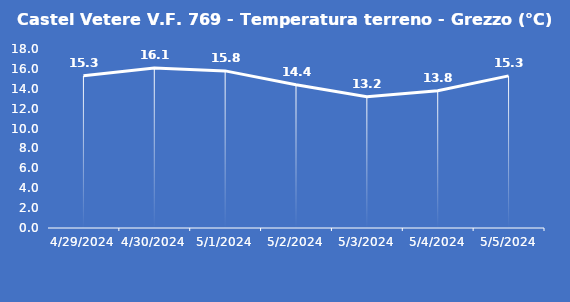
| Category | Castel Vetere V.F. 769 - Temperatura terreno - Grezzo (°C) |
|---|---|
| 4/29/24 | 15.3 |
| 4/30/24 | 16.1 |
| 5/1/24 | 15.8 |
| 5/2/24 | 14.4 |
| 5/3/24 | 13.2 |
| 5/4/24 | 13.8 |
| 5/5/24 | 15.3 |